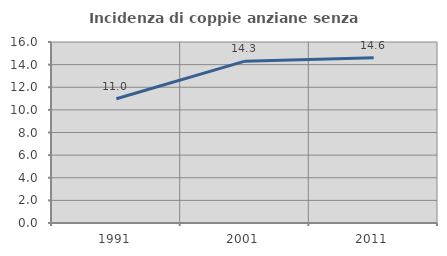
| Category | Incidenza di coppie anziane senza figli  |
|---|---|
| 1991.0 | 10.979 |
| 2001.0 | 14.309 |
| 2011.0 | 14.603 |